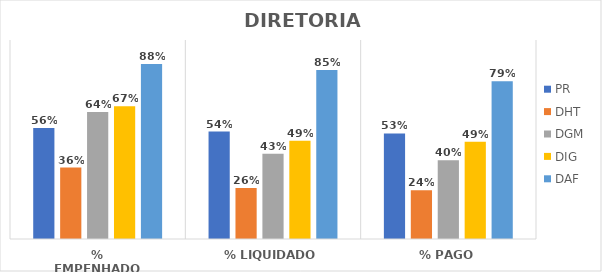
| Category | PR | DHT | DGM | DIG | DAF |
|---|---|---|---|---|---|
| % EMPENHADO | 0.558 | 0.359 | 0.638 | 0.667 | 0.879 |
| % LIQUIDADO | 0.54 | 0.257 | 0.428 | 0.493 | 0.85 |
| % PAGO | 0.531 | 0.245 | 0.395 | 0.488 | 0.793 |